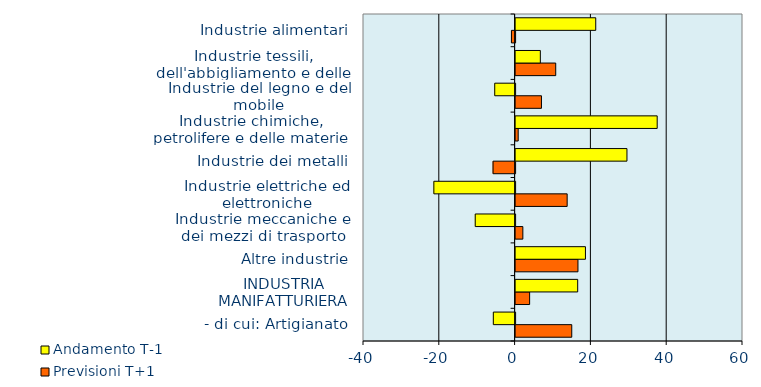
| Category | Previsioni T+1 | Andamento T-1 |
|---|---|---|
|  - di cui: Artigianato | 14.818 | -5.743 |
| INDUSTRIA MANIFATTURIERA | 3.703 | 16.386 |
| Altre industrie | 16.455 | 18.43 |
| Industrie meccaniche e dei mezzi di trasporto | 1.912 | -10.516 |
| Industrie elettriche ed elettroniche | 13.604 | -21.437 |
| Industrie dei metalli | -5.816 | 29.382 |
| Industrie chimiche, petrolifere e delle materie plastiche | 0.683 | 37.36 |
| Industrie del legno e del mobile | 6.822 | -5.375 |
| Industrie tessili, dell'abbigliamento e delle calzature | 10.587 | 6.526 |
| Industrie alimentari | -0.965 | 21.144 |